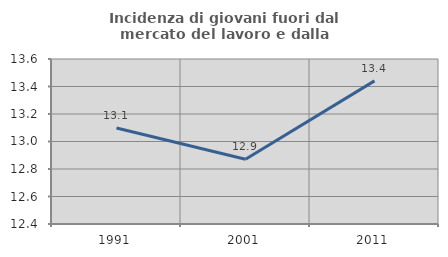
| Category | Incidenza di giovani fuori dal mercato del lavoro e dalla formazione  |
|---|---|
| 1991.0 | 13.098 |
| 2001.0 | 12.871 |
| 2011.0 | 13.441 |